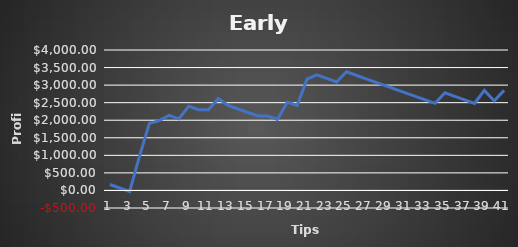
| Category | Series 0 |
|---|---|
| 0 | 170 |
| 1 | 70 |
| 2 | -30 |
| 3 | 970 |
| 4 | 1910 |
| 5 | 1990 |
| 6 | 2140 |
| 7 | 2040 |
| 8 | 2400 |
| 9 | 2300 |
| 10 | 2300 |
| 11 | 2620 |
| 12 | 2420 |
| 13 | 2320 |
| 14 | 2220 |
| 15 | 2120 |
| 16 | 2120 |
| 17 | 2020 |
| 18 | 2520 |
| 19 | 2420 |
| 20 | 3170 |
| 21 | 3290 |
| 22 | 3190 |
| 23 | 3090 |
| 24 | 3380 |
| 25 | 3280 |
| 26 | 3180 |
| 27 | 3080 |
| 28 | 2980 |
| 29 | 2880 |
| 30 | 2780 |
| 31 | 2680 |
| 32 | 2580 |
| 33 | 2480 |
| 34 | 2780 |
| 35 | 2680 |
| 36 | 2580 |
| 37 | 2480 |
| 38 | 2850 |
| 39 | 2550 |
| 40 | 2850 |